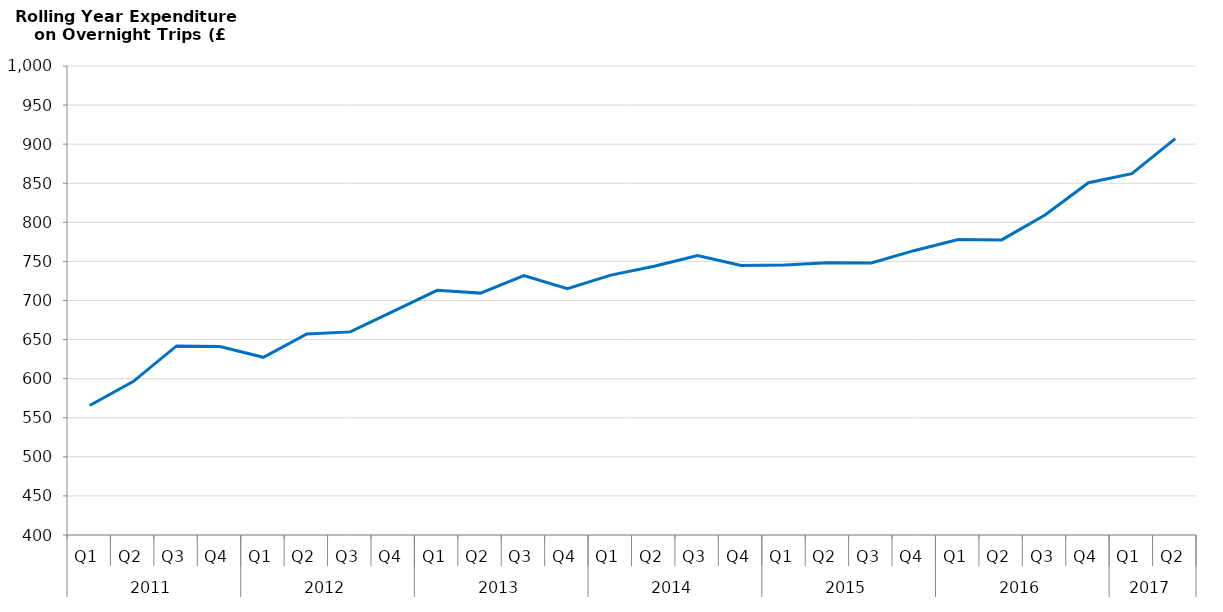
| Category | Rolling Year Expenditure during Overnight Trips (£) |
|---|---|
| 0 | 565729554.001 |
| 1 | 596312192.593 |
| 2 | 641866557.5 |
| 3 | 641047679.387 |
| 4 | 627323887.721 |
| 5 | 657242377.112 |
| 6 | 659852225.798 |
| 7 | 686321849.941 |
| 8 | 712983579.382 |
| 9 | 709441918.473 |
| 10 | 731788868.702 |
| 11 | 715190933.753 |
| 12 | 732440715.999 |
| 13 | 743830056.838 |
| 14 | 757659736.92 |
| 15 | 744902295.731 |
| 16 | 745261550.624 |
| 17 | 748317146.573 |
| 18 | 747907058.216 |
| 19 | 764066271.956 |
| 20 | 778038524.364 |
| 21 | 777511283.851 |
| 22 | 809333487.806 |
| 23 | 850707667.923 |
| 24 | 862269362.203 |
| 25 | 907086066.688 |